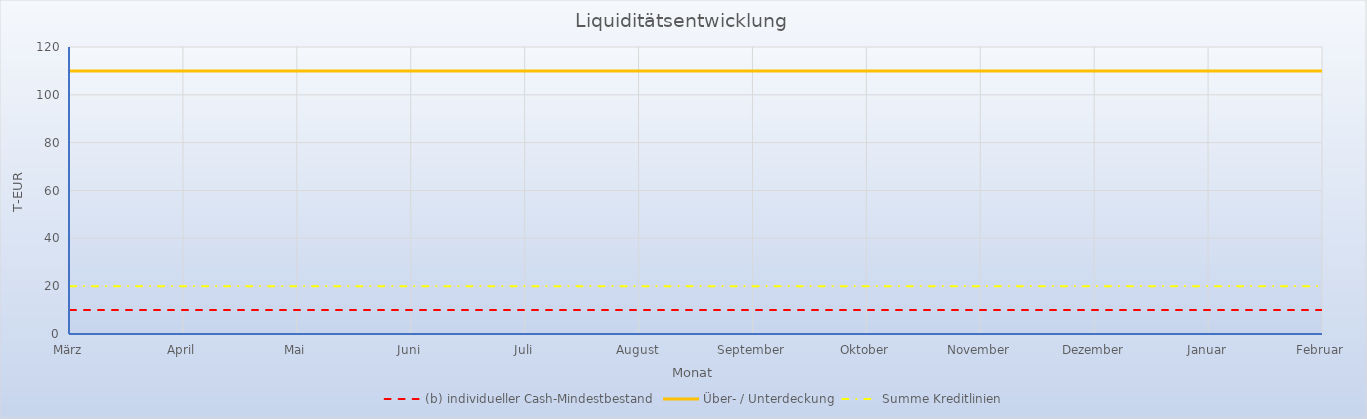
| Category | (b) individueller Cash-Mindestbestand |  Über- / Unterdeckung  |  Summe Kreditlinien  |
|---|---|---|---|
| März | 10 | 110 | 20 |
| April | 10 | 110 | 20 |
| Mai | 10 | 110 | 20 |
| Juni | 10 | 110 | 20 |
| Juli | 10 | 110 | 20 |
| August | 10 | 110 | 20 |
| September | 10 | 110 | 20 |
| Oktober | 10 | 110 | 20 |
| November | 10 | 110 | 20 |
| Dezember | 10 | 110 | 20 |
| Januar | 10 | 110 | 20 |
| Februar | 10 | 110 | 20 |